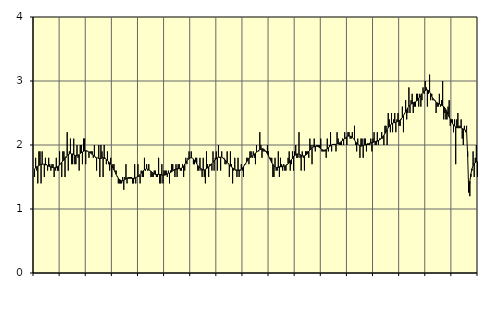
| Category | Hotell och restaurang, SNI 55-56 | Series 1 |
|---|---|---|
| nan | 1.5 | 1.62 |
| 87.0 | 1.8 | 1.65 |
| 87.0 | 1.6 | 1.66 |
| 87.0 | 1.4 | 1.67 |
| 87.0 | 1.9 | 1.68 |
| 87.0 | 1.9 | 1.69 |
| 87.0 | 1.4 | 1.7 |
| 87.0 | 1.9 | 1.7 |
| 87.0 | 1.7 | 1.7 |
| 87.0 | 1.5 | 1.7 |
| 87.0 | 1.8 | 1.69 |
| 87.0 | 1.7 | 1.69 |
| nan | 1.6 | 1.68 |
| 88.0 | 1.8 | 1.67 |
| 88.0 | 1.7 | 1.66 |
| 88.0 | 1.6 | 1.66 |
| 88.0 | 1.7 | 1.65 |
| 88.0 | 1.7 | 1.65 |
| 88.0 | 1.5 | 1.64 |
| 88.0 | 1.6 | 1.65 |
| 88.0 | 1.8 | 1.65 |
| 88.0 | 1.6 | 1.66 |
| 88.0 | 1.6 | 1.67 |
| 88.0 | 1.9 | 1.69 |
| nan | 1.7 | 1.71 |
| 89.0 | 1.5 | 1.73 |
| 89.0 | 1.9 | 1.75 |
| 89.0 | 1.9 | 1.77 |
| 89.0 | 1.5 | 1.8 |
| 89.0 | 1.8 | 1.82 |
| 89.0 | 2.2 | 1.84 |
| 89.0 | 1.6 | 1.85 |
| 89.0 | 1.9 | 1.86 |
| 89.0 | 2.1 | 1.87 |
| 89.0 | 1.7 | 1.86 |
| 89.0 | 1.7 | 1.86 |
| nan | 2.1 | 1.85 |
| 90.0 | 1.7 | 1.84 |
| 90.0 | 1.7 | 1.83 |
| 90.0 | 2 | 1.84 |
| 90.0 | 1.8 | 1.84 |
| 90.0 | 1.6 | 1.85 |
| 90.0 | 2 | 1.87 |
| 90.0 | 2 | 1.88 |
| 90.0 | 1.7 | 1.89 |
| 90.0 | 2.1 | 1.9 |
| 90.0 | 2.1 | 1.91 |
| 90.0 | 1.7 | 1.91 |
| nan | 1.9 | 1.91 |
| 91.0 | 1.9 | 1.9 |
| 91.0 | 1.8 | 1.89 |
| 91.0 | 1.9 | 1.88 |
| 91.0 | 1.9 | 1.87 |
| 91.0 | 1.9 | 1.85 |
| 91.0 | 1.8 | 1.84 |
| 91.0 | 2 | 1.83 |
| 91.0 | 1.8 | 1.81 |
| 91.0 | 1.6 | 1.8 |
| 91.0 | 1.8 | 1.8 |
| 91.0 | 2 | 1.79 |
| nan | 1.5 | 1.79 |
| 92.0 | 2 | 1.79 |
| 92.0 | 1.9 | 1.8 |
| 92.0 | 1.5 | 1.8 |
| 92.0 | 2 | 1.79 |
| 92.0 | 1.8 | 1.79 |
| 92.0 | 1.7 | 1.77 |
| 92.0 | 1.9 | 1.76 |
| 92.0 | 1.7 | 1.74 |
| 92.0 | 1.6 | 1.72 |
| 92.0 | 1.8 | 1.7 |
| 92.0 | 1.5 | 1.67 |
| nan | 1.7 | 1.64 |
| 93.0 | 1.7 | 1.61 |
| 93.0 | 1.6 | 1.58 |
| 93.0 | 1.6 | 1.54 |
| 93.0 | 1.5 | 1.51 |
| 93.0 | 1.4 | 1.48 |
| 93.0 | 1.4 | 1.46 |
| 93.0 | 1.4 | 1.45 |
| 93.0 | 1.4 | 1.44 |
| 93.0 | 1.5 | 1.44 |
| 93.0 | 1.3 | 1.45 |
| 93.0 | 1.5 | 1.46 |
| nan | 1.7 | 1.47 |
| 94.0 | 1.4 | 1.48 |
| 94.0 | 1.5 | 1.48 |
| 94.0 | 1.5 | 1.48 |
| 94.0 | 1.5 | 1.48 |
| 94.0 | 1.5 | 1.48 |
| 94.0 | 1.4 | 1.48 |
| 94.0 | 1.4 | 1.48 |
| 94.0 | 1.7 | 1.48 |
| 94.0 | 1.4 | 1.49 |
| 94.0 | 1.5 | 1.5 |
| 94.0 | 1.7 | 1.51 |
| nan | 1.5 | 1.52 |
| 95.0 | 1.4 | 1.54 |
| 95.0 | 1.6 | 1.56 |
| 95.0 | 1.5 | 1.58 |
| 95.0 | 1.5 | 1.6 |
| 95.0 | 1.8 | 1.61 |
| 95.0 | 1.6 | 1.62 |
| 95.0 | 1.7 | 1.63 |
| 95.0 | 1.6 | 1.62 |
| 95.0 | 1.7 | 1.61 |
| 95.0 | 1.6 | 1.6 |
| 95.0 | 1.5 | 1.59 |
| nan | 1.5 | 1.57 |
| 96.0 | 1.5 | 1.56 |
| 96.0 | 1.6 | 1.55 |
| 96.0 | 1.6 | 1.54 |
| 96.0 | 1.5 | 1.54 |
| 96.0 | 1.5 | 1.54 |
| 96.0 | 1.8 | 1.54 |
| 96.0 | 1.4 | 1.54 |
| 96.0 | 1.4 | 1.54 |
| 96.0 | 1.7 | 1.53 |
| 96.0 | 1.4 | 1.53 |
| 96.0 | 1.6 | 1.53 |
| nan | 1.6 | 1.53 |
| 97.0 | 1.6 | 1.54 |
| 97.0 | 1.5 | 1.55 |
| 97.0 | 1.6 | 1.56 |
| 97.0 | 1.4 | 1.56 |
| 97.0 | 1.6 | 1.57 |
| 97.0 | 1.7 | 1.58 |
| 97.0 | 1.7 | 1.6 |
| 97.0 | 1.6 | 1.61 |
| 97.0 | 1.5 | 1.62 |
| 97.0 | 1.7 | 1.62 |
| 97.0 | 1.5 | 1.63 |
| nan | 1.7 | 1.63 |
| 98.0 | 1.7 | 1.63 |
| 98.0 | 1.6 | 1.63 |
| 98.0 | 1.6 | 1.64 |
| 98.0 | 1.7 | 1.65 |
| 98.0 | 1.5 | 1.67 |
| 98.0 | 1.6 | 1.7 |
| 98.0 | 1.8 | 1.72 |
| 98.0 | 1.7 | 1.75 |
| 98.0 | 1.8 | 1.77 |
| 98.0 | 1.9 | 1.79 |
| 98.0 | 1.8 | 1.8 |
| nan | 1.9 | 1.8 |
| 99.0 | 1.8 | 1.8 |
| 99.0 | 1.7 | 1.78 |
| 99.0 | 1.7 | 1.76 |
| 99.0 | 1.8 | 1.74 |
| 99.0 | 1.8 | 1.71 |
| 99.0 | 1.6 | 1.68 |
| 99.0 | 1.6 | 1.66 |
| 99.0 | 1.8 | 1.64 |
| 99.0 | 1.6 | 1.63 |
| 99.0 | 1.5 | 1.62 |
| 99.0 | 1.8 | 1.61 |
| nan | 1.5 | 1.61 |
| 0.0 | 1.4 | 1.62 |
| 0.0 | 1.9 | 1.63 |
| 0.0 | 1.7 | 1.64 |
| 0.0 | 1.5 | 1.66 |
| 0.0 | 1.7 | 1.67 |
| 0.0 | 1.7 | 1.69 |
| 0.0 | 1.6 | 1.71 |
| 0.0 | 1.9 | 1.73 |
| 0.0 | 1.6 | 1.75 |
| 0.0 | 1.8 | 1.77 |
| 0.0 | 1.9 | 1.78 |
| nan | 1.6 | 1.8 |
| 1.0 | 2 | 1.81 |
| 1.0 | 1.8 | 1.81 |
| 1.0 | 1.6 | 1.81 |
| 1.0 | 1.9 | 1.81 |
| 1.0 | 1.8 | 1.8 |
| 1.0 | 1.8 | 1.78 |
| 1.0 | 1.7 | 1.77 |
| 1.0 | 1.7 | 1.75 |
| 1.0 | 1.9 | 1.73 |
| 1.0 | 1.7 | 1.71 |
| 1.0 | 1.5 | 1.69 |
| nan | 1.9 | 1.67 |
| 2.0 | 1.7 | 1.66 |
| 2.0 | 1.4 | 1.64 |
| 2.0 | 1.6 | 1.63 |
| 2.0 | 1.8 | 1.62 |
| 2.0 | 1.6 | 1.61 |
| 2.0 | 1.5 | 1.61 |
| 2.0 | 1.8 | 1.6 |
| 2.0 | 1.5 | 1.61 |
| 2.0 | 1.6 | 1.61 |
| 2.0 | 1.7 | 1.62 |
| 2.0 | 1.6 | 1.64 |
| nan | 1.5 | 1.66 |
| 3.0 | 1.7 | 1.69 |
| 3.0 | 1.7 | 1.71 |
| 3.0 | 1.8 | 1.74 |
| 3.0 | 1.8 | 1.77 |
| 3.0 | 1.7 | 1.79 |
| 3.0 | 1.9 | 1.8 |
| 3.0 | 1.9 | 1.82 |
| 3.0 | 1.8 | 1.83 |
| 3.0 | 1.9 | 1.84 |
| 3.0 | 1.8 | 1.86 |
| 3.0 | 1.7 | 1.87 |
| nan | 2 | 1.89 |
| 4.0 | 1.9 | 1.9 |
| 4.0 | 1.9 | 1.92 |
| 4.0 | 2.2 | 1.93 |
| 4.0 | 2 | 1.93 |
| 4.0 | 1.8 | 1.94 |
| 4.0 | 1.9 | 1.94 |
| 4.0 | 1.9 | 1.93 |
| 4.0 | 1.9 | 1.91 |
| 4.0 | 1.9 | 1.89 |
| 4.0 | 2 | 1.86 |
| 4.0 | 1.9 | 1.83 |
| nan | 1.8 | 1.79 |
| 5.0 | 1.8 | 1.76 |
| 5.0 | 1.8 | 1.72 |
| 5.0 | 1.5 | 1.7 |
| 5.0 | 1.5 | 1.67 |
| 5.0 | 1.8 | 1.66 |
| 5.0 | 1.6 | 1.65 |
| 5.0 | 1.6 | 1.65 |
| 5.0 | 1.9 | 1.65 |
| 5.0 | 1.5 | 1.66 |
| 5.0 | 1.8 | 1.66 |
| 5.0 | 1.7 | 1.66 |
| nan | 1.6 | 1.67 |
| 6.0 | 1.7 | 1.67 |
| 6.0 | 1.6 | 1.67 |
| 6.0 | 1.6 | 1.68 |
| 6.0 | 1.7 | 1.69 |
| 6.0 | 1.8 | 1.71 |
| 6.0 | 1.9 | 1.72 |
| 6.0 | 1.6 | 1.75 |
| 6.0 | 1.7 | 1.77 |
| 6.0 | 1.9 | 1.79 |
| 6.0 | 1.6 | 1.82 |
| 6.0 | 1.9 | 1.83 |
| nan | 2 | 1.85 |
| 7.0 | 1.8 | 1.86 |
| 7.0 | 1.8 | 1.86 |
| 7.0 | 2.2 | 1.86 |
| 7.0 | 1.8 | 1.85 |
| 7.0 | 1.6 | 1.84 |
| 7.0 | 1.9 | 1.83 |
| 7.0 | 1.8 | 1.83 |
| 7.0 | 1.6 | 1.83 |
| 7.0 | 1.9 | 1.84 |
| 7.0 | 1.9 | 1.85 |
| 7.0 | 1.9 | 1.87 |
| nan | 1.8 | 1.9 |
| 8.0 | 2.1 | 1.92 |
| 8.0 | 2 | 1.94 |
| 8.0 | 1.7 | 1.95 |
| 8.0 | 2 | 1.97 |
| 8.0 | 2.1 | 1.97 |
| 8.0 | 1.9 | 1.98 |
| 8.0 | 2 | 1.98 |
| 8.0 | 2 | 1.98 |
| 8.0 | 2 | 1.97 |
| 8.0 | 2 | 1.96 |
| 8.0 | 2.1 | 1.94 |
| nan | 1.9 | 1.93 |
| 9.0 | 1.9 | 1.92 |
| 9.0 | 1.9 | 1.92 |
| 9.0 | 1.9 | 1.92 |
| 9.0 | 1.8 | 1.93 |
| 9.0 | 2.1 | 1.94 |
| 9.0 | 1.9 | 1.96 |
| 9.0 | 2 | 1.97 |
| 9.0 | 2.2 | 1.99 |
| 9.0 | 1.9 | 2 |
| 9.0 | 2 | 2.01 |
| 9.0 | 2 | 2.01 |
| nan | 2 | 2.01 |
| 10.0 | 1.9 | 2.01 |
| 10.0 | 2.2 | 2.02 |
| 10.0 | 2.1 | 2.02 |
| 10.0 | 2 | 2.03 |
| 10.0 | 2 | 2.04 |
| 10.0 | 2 | 2.06 |
| 10.0 | 2.1 | 2.07 |
| 10.0 | 2 | 2.09 |
| 10.0 | 2.2 | 2.1 |
| 10.0 | 2.1 | 2.11 |
| 10.0 | 2 | 2.13 |
| nan | 2.2 | 2.14 |
| 11.0 | 2.2 | 2.14 |
| 11.0 | 2.1 | 2.14 |
| 11.0 | 2.1 | 2.13 |
| 11.0 | 2.2 | 2.12 |
| 11.0 | 2.1 | 2.1 |
| 11.0 | 2.3 | 2.08 |
| 11.0 | 2 | 2.05 |
| 11.0 | 1.9 | 2.03 |
| 11.0 | 2.1 | 2.01 |
| 11.0 | 2 | 2 |
| 11.0 | 1.8 | 1.99 |
| nan | 2.1 | 1.98 |
| 12.0 | 2.1 | 1.99 |
| 12.0 | 1.8 | 1.99 |
| 12.0 | 2.1 | 2 |
| 12.0 | 2.1 | 2 |
| 12.0 | 1.9 | 2.01 |
| 12.0 | 2 | 2.02 |
| 12.0 | 2 | 2.02 |
| 12.0 | 2 | 2.03 |
| 12.0 | 2.1 | 2.03 |
| 12.0 | 1.9 | 2.04 |
| 12.0 | 2.1 | 2.04 |
| nan | 2.2 | 2.05 |
| 13.0 | 2 | 2.05 |
| 13.0 | 2 | 2.06 |
| 13.0 | 2.2 | 2.06 |
| 13.0 | 2 | 2.07 |
| 13.0 | 2.1 | 2.08 |
| 13.0 | 2.1 | 2.09 |
| 13.0 | 2.2 | 2.11 |
| 13.0 | 2.1 | 2.13 |
| 13.0 | 2 | 2.15 |
| 13.0 | 2.3 | 2.18 |
| 13.0 | 2.3 | 2.21 |
| nan | 2 | 2.24 |
| 14.0 | 2.5 | 2.27 |
| 14.0 | 2.4 | 2.29 |
| 14.0 | 2.2 | 2.31 |
| 14.0 | 2.5 | 2.33 |
| 14.0 | 2.2 | 2.34 |
| 14.0 | 2.4 | 2.35 |
| 14.0 | 2.5 | 2.35 |
| 14.0 | 2.2 | 2.35 |
| 14.0 | 2.4 | 2.36 |
| 14.0 | 2.5 | 2.37 |
| 14.0 | 2.3 | 2.38 |
| nan | 2.3 | 2.39 |
| 15.0 | 2.4 | 2.41 |
| 15.0 | 2.6 | 2.43 |
| 15.0 | 2.2 | 2.46 |
| 15.0 | 2.5 | 2.49 |
| 15.0 | 2.7 | 2.52 |
| 15.0 | 2.4 | 2.55 |
| 15.0 | 2.5 | 2.58 |
| 15.0 | 2.9 | 2.6 |
| 15.0 | 2.5 | 2.62 |
| 15.0 | 2.7 | 2.64 |
| 15.0 | 2.8 | 2.65 |
| nan | 2.5 | 2.66 |
| 16.0 | 2.6 | 2.67 |
| 16.0 | 2.6 | 2.67 |
| 16.0 | 2.8 | 2.69 |
| 16.0 | 2.8 | 2.7 |
| 16.0 | 2.6 | 2.73 |
| 16.0 | 2.8 | 2.75 |
| 16.0 | 2.6 | 2.77 |
| 16.0 | 2.7 | 2.8 |
| 16.0 | 2.9 | 2.82 |
| 16.0 | 2.8 | 2.84 |
| 16.0 | 3 | 2.85 |
| nan | 2.9 | 2.86 |
| 17.0 | 2.6 | 2.86 |
| 17.0 | 2.8 | 2.85 |
| 17.0 | 3.1 | 2.83 |
| 17.0 | 2.7 | 2.8 |
| 17.0 | 2.8 | 2.76 |
| 17.0 | 2.7 | 2.73 |
| 17.0 | 2.7 | 2.71 |
| 17.0 | 2.7 | 2.69 |
| 17.0 | 2.5 | 2.67 |
| 17.0 | 2.6 | 2.66 |
| 17.0 | 2.6 | 2.65 |
| nan | 2.8 | 2.64 |
| 18.0 | 2.6 | 2.63 |
| 18.0 | 2.7 | 2.62 |
| 18.0 | 3 | 2.61 |
| 18.0 | 2.4 | 2.6 |
| 18.0 | 2.5 | 2.58 |
| 18.0 | 2.4 | 2.55 |
| 18.0 | 2.4 | 2.52 |
| 18.0 | 2.6 | 2.48 |
| 18.0 | 2.7 | 2.44 |
| 18.0 | 2.3 | 2.4 |
| 18.0 | 2.4 | 2.36 |
| nan | 2.4 | 2.34 |
| 19.0 | 2.2 | 2.31 |
| 19.0 | 2.4 | 2.3 |
| 19.0 | 1.7 | 2.28 |
| 19.0 | 2.4 | 2.27 |
| 19.0 | 2.5 | 2.27 |
| 19.0 | 2.3 | 2.27 |
| 19.0 | 2.3 | 2.27 |
| 19.0 | 2.4 | 2.27 |
| 19.0 | 2.1 | 2.26 |
| 19.0 | 2 | 2.25 |
| 19.0 | 2.3 | 2.24 |
| nan | 2.2 | 2.23 |
| 20.0 | 2.3 | 2.23 |
| 20.0 | 1.9 | 1.82 |
| 20.0 | 1.4 | 1.26 |
| 20.0 | 1.2 | 1.43 |
| 20.0 | 1.5 | 1.55 |
| 20.0 | 1.6 | 1.63 |
| 20.0 | 1.9 | 1.68 |
| 20.0 | 1.5 | 1.71 |
| 20.0 | 1.8 | 1.72 |
| 20.0 | 2 | 1.74 |
| 20.0 | 1.5 | 1.74 |